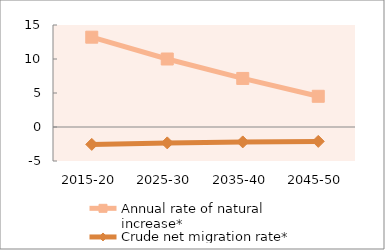
| Category | Annual rate of natural increase* | Crude net migration rate* |
|---|---|---|
| 2015-20 | 13.209 | -2.559 |
| 2025-30 | 10 | -2.335 |
| 2035-40 | 7.141 | -2.193 |
| 2045-50 | 4.516 | -2.115 |